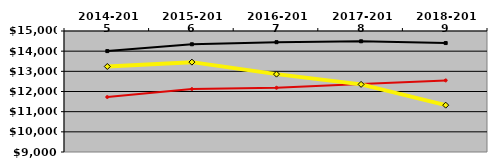
| Category | NATIONAL MEDIAN | WEST MEDIAN | TEXAS LUTHERAN |
|---|---|---|---|
| 2014-2015 | 14002.887 | 11726.401 | 13239.91 |
| 2015-2016 | 14342.086 | 12120.661 | 13456.186 |
| 2016-2017 | 14445.621 | 12184.106 | 12861.172 |
| 2017-2018 | 14489.448 | 12366.889 | 12353.524 |
| 2018-2019 | 14402.238 | 12550.288 | 11322.153 |